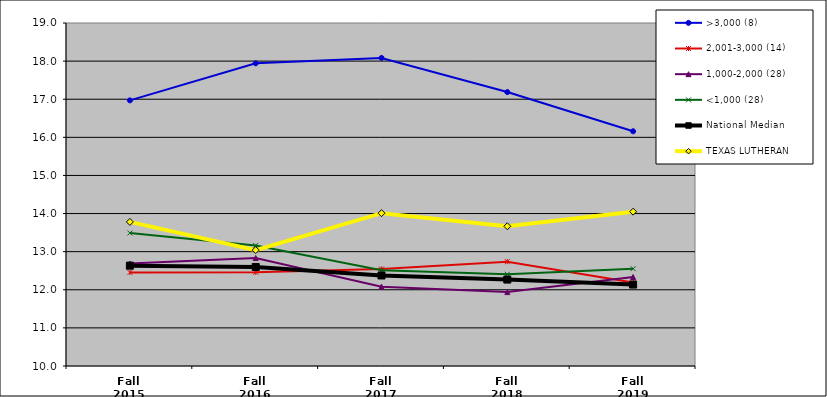
| Category | >3,000 (8) | 2,001-3,000 (14) | 1,000-2,000 (28) | <1,000 (28) | National Median | TEXAS LUTHERAN |
|---|---|---|---|---|---|---|
| Fall 2015 | 16.97 | 12.454 | 12.689 | 13.49 | 12.633 | 13.781 |
| Fall 2016 | 17.942 | 12.46 | 12.833 | 13.162 | 12.599 | 13.042 |
| Fall 2017 | 18.084 | 12.545 | 12.082 | 12.51 | 12.375 | 14.01 |
| Fall 2018 | 17.188 | 12.738 | 11.939 | 12.407 | 12.268 | 13.667 |
| Fall 2019 | 16.159 | 12.189 | 12.335 | 12.554 | 12.137 | 14.049 |